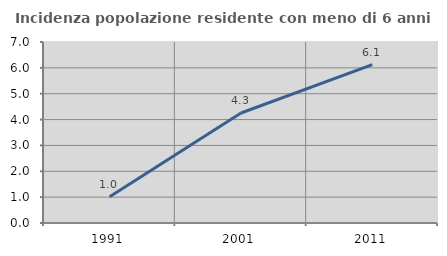
| Category | Incidenza popolazione residente con meno di 6 anni |
|---|---|
| 1991.0 | 1.015 |
| 2001.0 | 4.255 |
| 2011.0 | 6.122 |